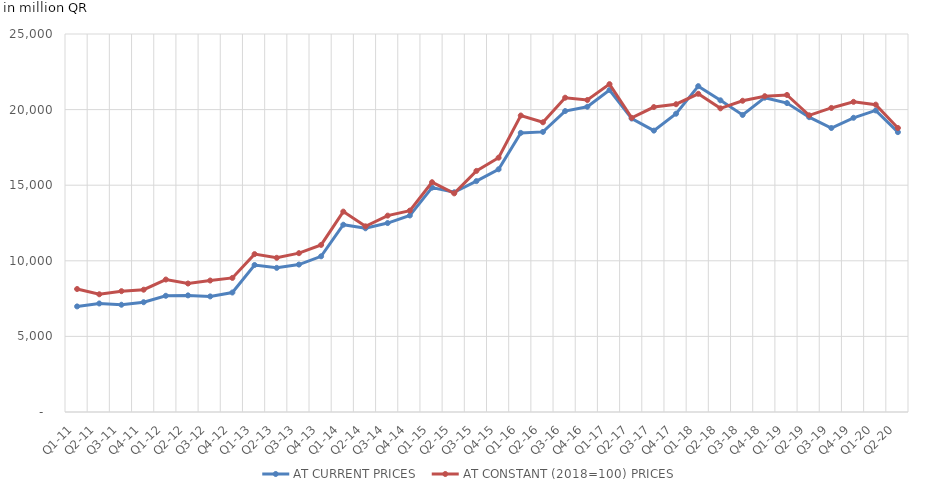
| Category | AT CURRENT PRICES | AT CONSTANT (2018=100) PRICES |
|---|---|---|
| Q1-11 | 6983.218 | 8133.584 |
| Q2-11 | 7177.383 | 7786.589 |
| Q3-11 | 7093.626 | 7991.549 |
| Q4-11 | 7260.809 | 8089.285 |
| Q1-12 | 7686.402 | 8760.777 |
| Q2-12 | 7713.016 | 8497.816 |
| Q3-12 | 7645.018 | 8696.22 |
| Q4-12 | 7902.671 | 8868.562 |
| Q1-13 | 9722.188 | 10441.891 |
| Q2-13 | 9533.225 | 10197.901 |
| Q3-13 | 9751.386 | 10504.47 |
| Q4-13 | 10297.704 | 11050.32 |
| Q1-14 | 12385.591 | 13252.823 |
| Q2-14 | 12150.991 | 12279.284 |
| Q3-14 | 12496.614 | 12987.452 |
| Q4-14 | 12997.452 | 13320.681 |
| Q1-15 | 14837.859 | 15196.995 |
| Q2-15 | 14532.45 | 14459.304 |
| Q3-15 | 15270.903 | 15945.784 |
| Q4-15 | 16051.887 | 16820.6 |
| Q1-16 | 18460.054 | 19609.391 |
| Q2-16 | 18526.188 | 19161.42 |
| Q3-16 | 19903.359 | 20786.172 |
| Q4-16 | 20189.064 | 20635.852 |
| Q1-17 | 21292.45 | 21684.648 |
| Q2-17 | 19409.145 | 19453.401 |
| Q3-17 | 18610.085 | 20166.812 |
| Q4-17 | 19728.291 | 20355.657 |
| Q1-18 | 21551.261 | 21044.737 |
| Q2-18 | 20613.474 | 20084.119 |
| Q3-18 | 19646.65 | 20584.322 |
| Q4-18 | 20788.609 | 20886.817 |
| Q1-19 | 20431.888 | 20968.948 |
| Q2-19 | 19499.529 | 19622.262 |
| Q3-19 | 18782.99 | 20110.076 |
| Q4-19 | 19459.427 | 20513.745 |
| Q1-20 | 19943.975 | 20328.097 |
| Q2-20 | 18509.868 | 18783.963 |